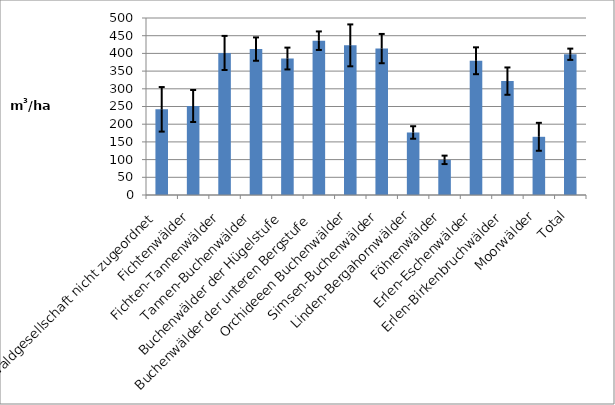
| Category | m³/ha |
|---|---|
| Waldgesellschaft nicht zugeordnet | 242 |
| Fichtenwälder | 251.4 |
| Fichten-Tannenwälder | 401.3 |
| Tannen-Buchenwälder | 412.2 |
| Buchenwälder der Hügelstufe | 385.5 |
| Buchenwälder der unteren Bergstufe | 435.9 |
| Orchideeen Buchenwälder | 422.7 |
| Simsen-Buchenwälder | 413.6 |
| Linden-Bergahornwälder | 176.6 |
| Föhrenwälder | 99.3 |
| Erlen-Eschenwälder | 379.2 |
| Erlen-Birkenbruchwälder | 321.7 |
| Moorwälder | 164.4 |
| Total | 397.6 |